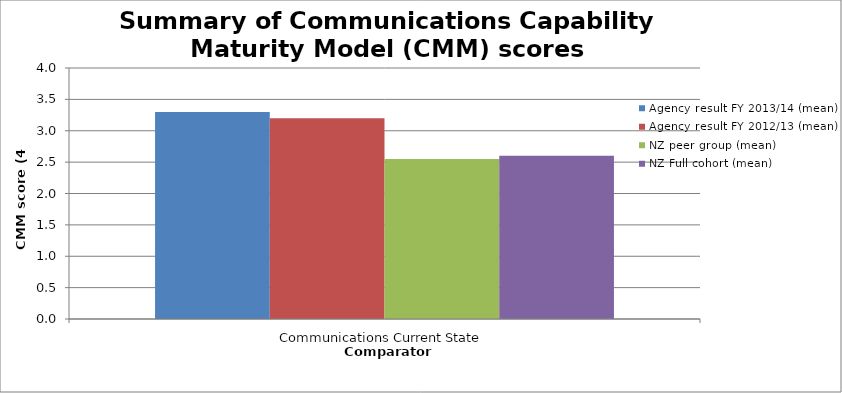
| Category | Agency result FY 2013/14 (mean) | Agency result FY 2012/13 (mean) | NZ peer group (mean) | NZ Full cohort (mean) |
|---|---|---|---|---|
| Communications Current State | 3.3 | 3.2 | 2.55 | 2.6 |